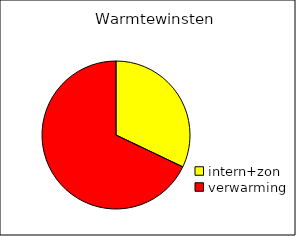
| Category | Series 0 |
|---|---|
| intern+zon | 8.881 |
| verwarming | 18.802 |